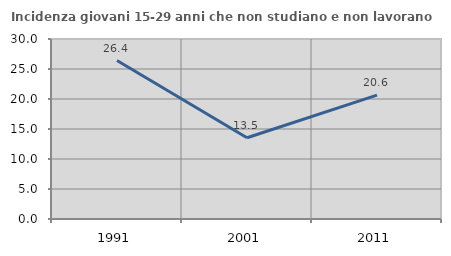
| Category | Incidenza giovani 15-29 anni che non studiano e non lavorano  |
|---|---|
| 1991.0 | 26.415 |
| 2001.0 | 13.537 |
| 2011.0 | 20.645 |